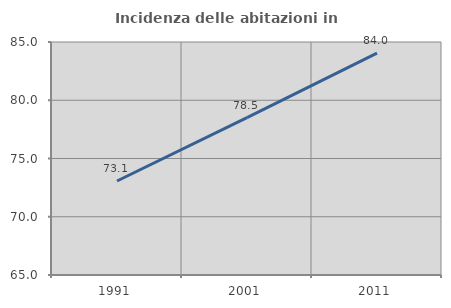
| Category | Incidenza delle abitazioni in proprietà  |
|---|---|
| 1991.0 | 73.067 |
| 2001.0 | 78.516 |
| 2011.0 | 84.039 |